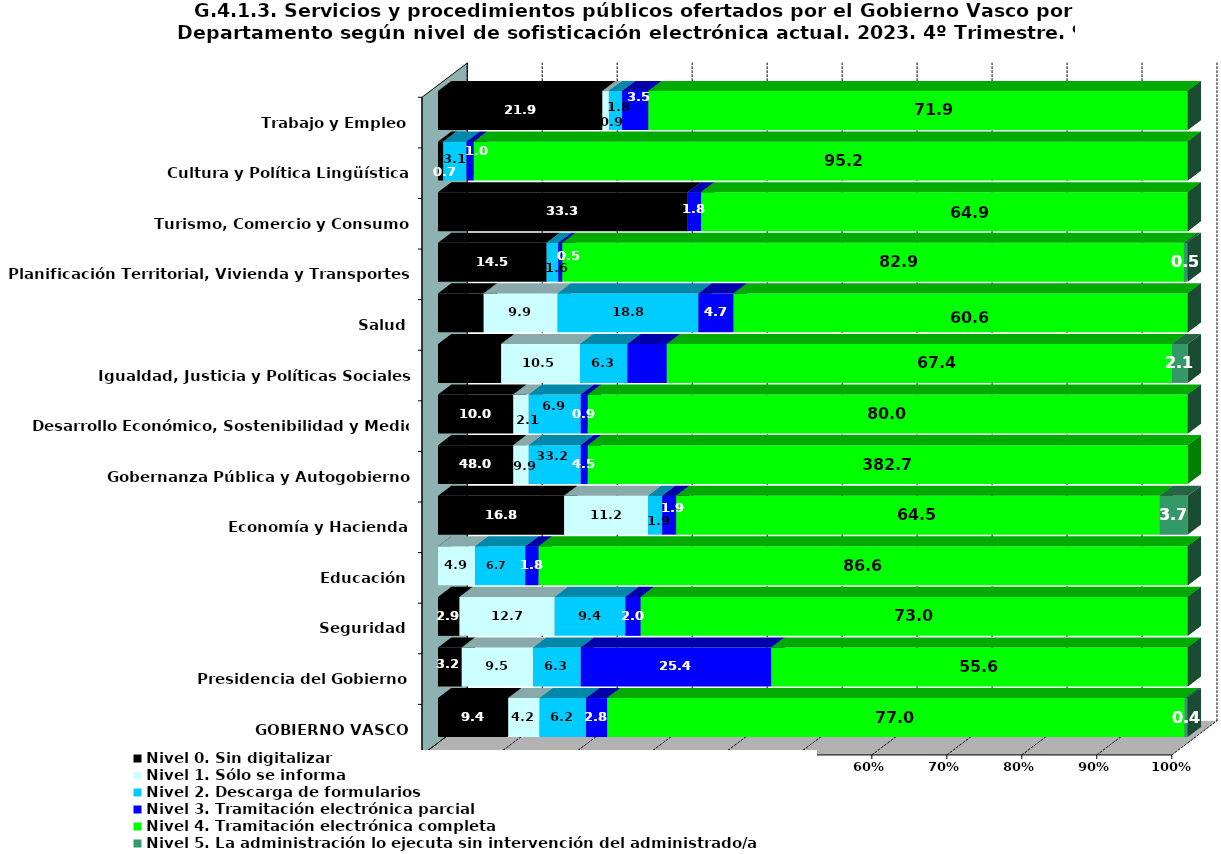
| Category | Nivel 0. Sin digitalizar | Nivel 1. Sólo se informa | Nivel 2. Descarga de formularios | Nivel 3. Tramitación electrónica parcial | Nivel 4. Tramitación electrónica completa | Nivel 5. La administración lo ejecuta sin intervención del administrado/a |
|---|---|---|---|---|---|---|
| GOBIERNO VASCO | 9.371 | 4.195 | 6.191 | 2.808 | 77.03 | 0.406 |
| Presidencia del Gobierno | 3.175 | 9.524 | 6.349 | 25.397 | 55.556 | 0 |
| Seguridad | 2.869 | 12.705 | 9.426 | 2.049 | 72.951 | 0 |
| Educación | 0 | 4.947 | 6.714 | 1.767 | 86.572 | 0 |
| Economía y Hacienda | 16.822 | 11.215 | 1.869 | 1.869 | 64.486 | 3.738 |
| Gobernanza Pública y Autogobierno | 48.02 | 9.901 | 33.168 | 4.455 | 382.673 | 0 |
| Desarrollo Económico, Sostenibilidad y Medio Ambiente | 10.041 | 2.07 | 6.936 | 0.932 | 80.021 | 0 |
| Igualdad, Justicia y Políticas Sociales | 8.421 | 10.526 | 6.316 | 5.263 | 67.368 | 2.105 |
| Salud | 6.103 | 9.859 | 18.779 | 4.695 | 60.563 | 0 |
| Planificación Territorial, Vivienda y Transportes | 14.508 | 0 | 1.554 | 0.518 | 82.902 | 0.518 |
| Turismo, Comercio y Consumo | 33.333 | 0 | 0 | 1.754 | 64.912 | 0 |
| Cultura y Política Lingüística | 0.716 | 0 | 3.103 | 0.955 | 95.227 | 0 |
| Trabajo y Empleo | 21.93 | 0.877 | 1.754 | 3.509 | 71.93 | 0 |